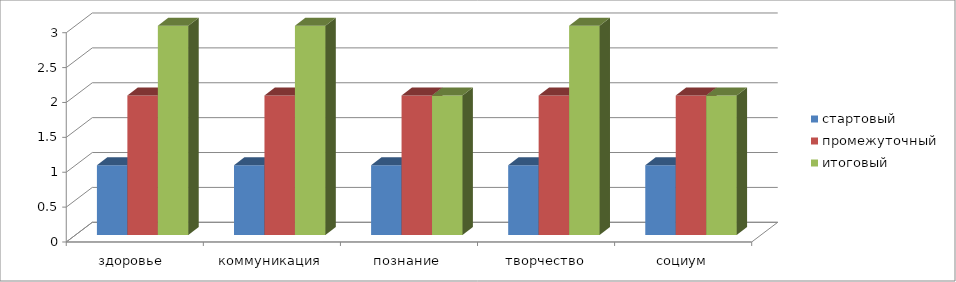
| Category | стартовый | промежуточный | итоговый |
|---|---|---|---|
| здоровье  | 1 | 2 | 3 |
| коммуникация | 1 | 2 | 3 |
| познание | 1 | 2 | 2 |
| творчество | 1 | 2 | 3 |
| социум | 1 | 2 | 2 |